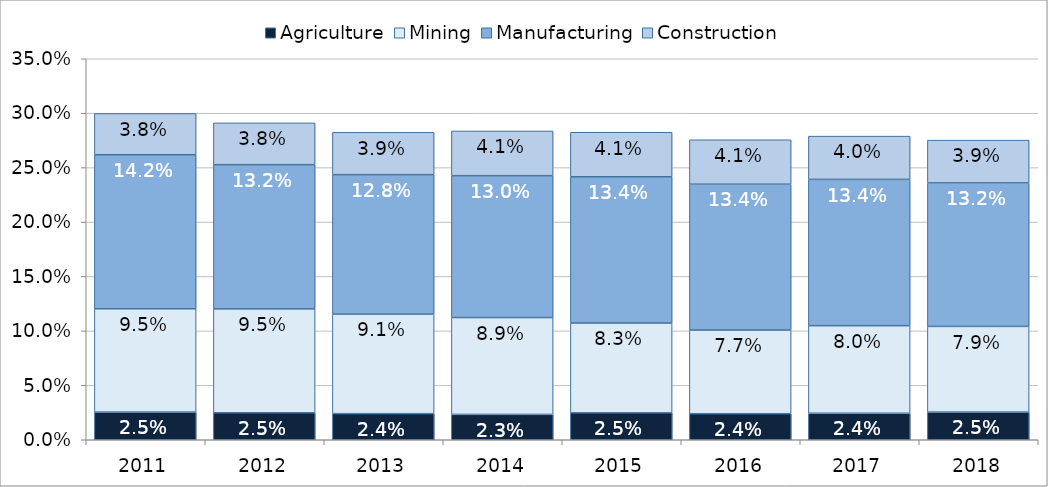
| Category | Agriculture | Mining | Manufacturing | Construction |
|---|---|---|---|---|
| 2011.0 | 0.025 | 0.095 | 0.142 | 0.038 |
| 2012.0 | 0.025 | 0.095 | 0.132 | 0.038 |
| 2013.0 | 0.024 | 0.091 | 0.128 | 0.039 |
| 2014.0 | 0.023 | 0.089 | 0.13 | 0.041 |
| 2015.0 | 0.025 | 0.083 | 0.134 | 0.041 |
| 2016.0 | 0.024 | 0.077 | 0.134 | 0.041 |
| 2017.0 | 0.024 | 0.08 | 0.134 | 0.04 |
| 2018.0 | 0.025 | 0.079 | 0.132 | 0.039 |